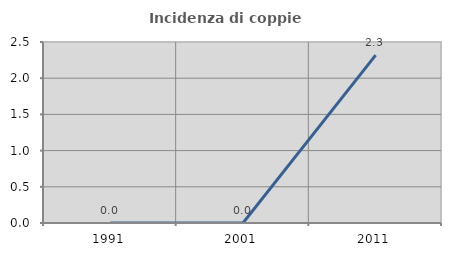
| Category | Incidenza di coppie miste |
|---|---|
| 1991.0 | 0 |
| 2001.0 | 0 |
| 2011.0 | 2.318 |